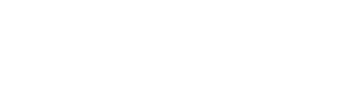
| Category | Average Daily Visitors |
|---|---|
| January | 595.871 |
| February | 565.643 |
| March | 609.097 |
| April | 645.3 |
| May | 617.613 |
| June | 606.433 |
| July | 576.452 |
| August | 591.452 |
| September | 630.967 |
| October | 653.645 |
| November | 604.467 |
| December | 630.484 |